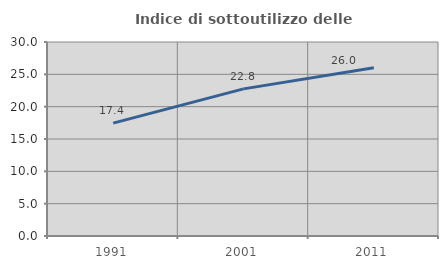
| Category | Indice di sottoutilizzo delle abitazioni  |
|---|---|
| 1991.0 | 17.449 |
| 2001.0 | 22.754 |
| 2011.0 | 26.002 |